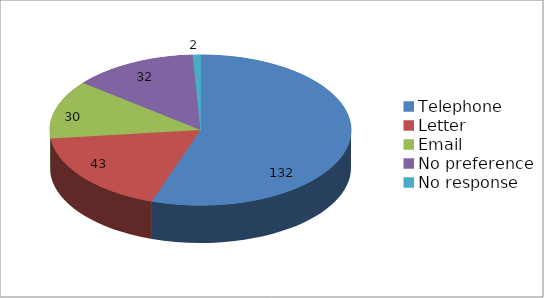
| Category | Series 0 |
|---|---|
| Telephone | 132 |
| Letter  | 43 |
| Email | 30 |
| No preference | 32 |
| No response | 2 |